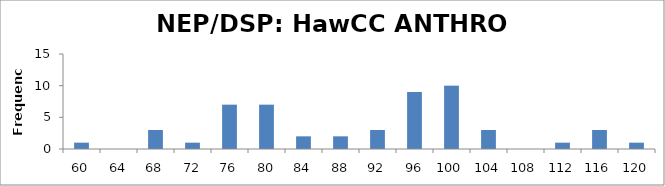
| Category | Frequency |
|---|---|
| 60.0 | 1 |
| 64.0 | 0 |
| 68.0 | 3 |
| 72.0 | 1 |
| 76.0 | 7 |
| 80.0 | 7 |
| 84.0 | 2 |
| 88.0 | 2 |
| 92.0 | 3 |
| 96.0 | 9 |
| 100.0 | 10 |
| 104.0 | 3 |
| 108.0 | 0 |
| 112.0 | 1 |
| 116.0 | 3 |
| 120.0 | 1 |